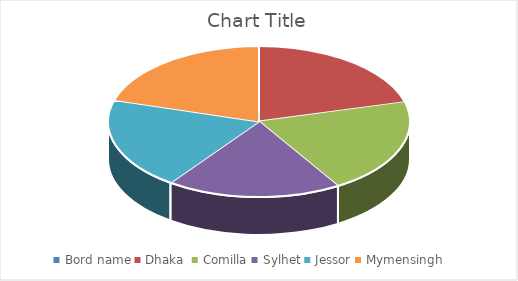
| Category | Series 0 | Series 1 |
|---|---|---|
| Bord name | 0 |  |
| Dhaka  | 0.87 |  |
| Comilla | 0.85 |  |
| Sylhet | 0.78 |  |
| Jessor | 0.82 |  |
| Mymensingh | 0.85 |  |